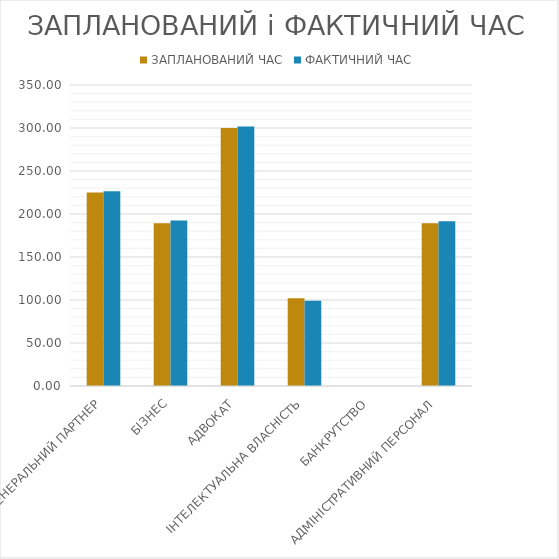
| Category | ЗАПЛАНОВАНИЙ ЧАС | ФАКТИЧНИЙ ЧАС |
|---|---|---|
| ГЕНЕРАЛЬНИЙ ПАРТНЕР | 225 | 226.5 |
| БІЗНЕС | 189.286 | 192.5 |
| АДВОКАТ | 300 | 301.714 |
| ІНТЕЛЕКТУАЛЬНА ВЛАСНІСТЬ | 102.143 | 99 |
| БАНКРУТСТВО | 0 | 0 |
| АДМІНІСТРАТИВНИЙ ПЕРСОНАЛ | 189.286 | 191.429 |